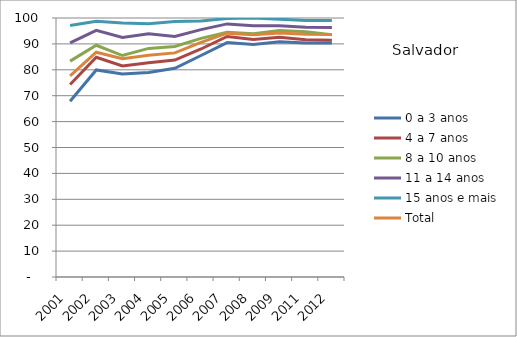
| Category | 0 a 3 anos | 4 a 7 anos | 8 a 10 anos | 11 a 14 anos | 15 anos e mais | Total |
|---|---|---|---|---|---|---|
| 2001.0 | 67.84 | 74.35 | 83.34 | 90.36 | 97.12 | 77.62 |
| 2002.0 | 79.95 | 84.86 | 89.48 | 95.23 | 98.78 | 86.79 |
| 2003.0 | 78.41 | 81.48 | 85.51 | 92.45 | 98.05 | 84.25 |
| 2004.0 | 78.92 | 82.68 | 88.27 | 93.91 | 97.77 | 85.61 |
| 2005.0 | 80.57 | 83.75 | 89 | 92.89 | 98.61 | 86.53 |
| 2006.0 | 85.53 | 88.03 | 92.12 | 95.5 | 98.87 | 90.56 |
| 2007.0 | 90.51 | 92.86 | 94.53 | 97.72 | 99.78 | 94.15 |
| 2008.0 | 89.81 | 91.66 | 93.9 | 96.98 | 100 | 93.56 |
| 2009.0 | 90.84 | 92.55 | 95.14 | 97.01 | 99.52 | 94.2 |
| 2011.0 | 90.31 | 91.57 | 94.67 | 96.39 | 99.04 | 93.68 |
| 2012.0 | 90.37 | 91.45 | 93.55 | 96.31 | 99.08 | 93.61 |